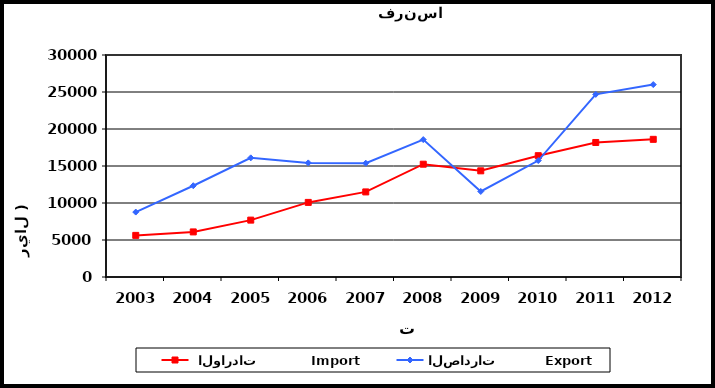
| Category |  الواردات           Import | الصادرات          Export |
|---|---|---|
| 2003.0 | 5624 | 8774 |
| 2004.0 | 6092 | 12335 |
| 2005.0 | 7687 | 16102 |
| 2006.0 | 10082 | 15420 |
| 2007.0 | 11499 | 15380 |
| 2008.0 | 15244 | 18568 |
| 2009.0 | 14346 | 11557 |
| 2010.0 | 16395 | 15739 |
| 2011.0 | 18178 | 24679 |
| 2012.0 | 18603 | 26002 |